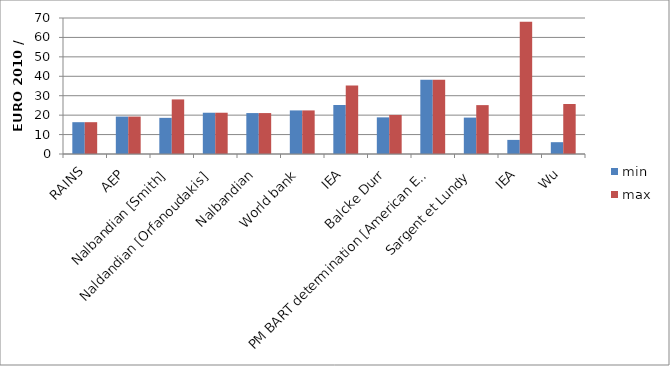
| Category | min | max |
|---|---|---|
| RAINS | 16.374 | 16.374 |
| AEP | 19.263 | 19.263 |
| Nalbandian [Smith] | 18.609 | 28.089 |
| Naldandian [Orfanoudakis] | 21.242 | 21.242 |
| Nalbandian | 21.067 | 21.067 |
| World bank | 22.433 | 22.433 |
| IEA | 25.23 | 35.321 |
| Balcke Durr | 18.858 | 20.102 |
| PM BART determination [American Electric Power] | 38.233 | 38.233 |
| Sargent et Lundy | 18.738 | 25.16 |
| IEA | 7.26 | 68.066 |
| Wu | 6.08 | 25.724 |